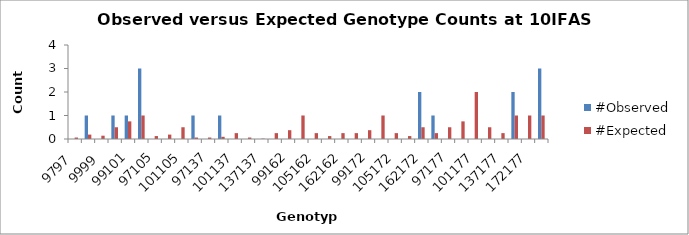
| Category | #Observed | #Expected |
|---|---|---|
| 9797.0 | 0 | 0.062 |
| 9799.0 | 1 | 0.188 |
| 9999.0 | 0 | 0.141 |
| 97101.0 | 1 | 0.5 |
| 99101.0 | 1 | 0.75 |
| 101101.0 | 3 | 1 |
| 97105.0 | 0 | 0.125 |
| 99105.0 | 0 | 0.188 |
| 101105.0 | 0 | 0.5 |
| 105105.0 | 1 | 0.062 |
| 97137.0 | 0 | 0.062 |
| 99137.0 | 1 | 0.094 |
| 101137.0 | 0 | 0.25 |
| 105137.0 | 0 | 0.062 |
| 137137.0 | 0 | 0.016 |
| 97162.0 | 0 | 0.25 |
| 99162.0 | 0 | 0.375 |
| 101162.0 | 0 | 1 |
| 105162.0 | 0 | 0.25 |
| 137162.0 | 0 | 0.125 |
| 162162.0 | 0 | 0.25 |
| 97172.0 | 0 | 0.25 |
| 99172.0 | 0 | 0.375 |
| 101172.0 | 0 | 1 |
| 105172.0 | 0 | 0.25 |
| 137172.0 | 0 | 0.125 |
| 162172.0 | 2 | 0.5 |
| 172172.0 | 1 | 0.25 |
| 97177.0 | 0 | 0.5 |
| 99177.0 | 0 | 0.75 |
| 101177.0 | 0 | 2 |
| 105177.0 | 0 | 0.5 |
| 137177.0 | 0 | 0.25 |
| 162177.0 | 2 | 1 |
| 172177.0 | 0 | 1 |
| 177177.0 | 3 | 1 |